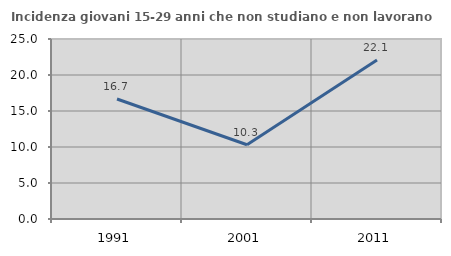
| Category | Incidenza giovani 15-29 anni che non studiano e non lavorano  |
|---|---|
| 1991.0 | 16.667 |
| 2001.0 | 10.309 |
| 2011.0 | 22.093 |